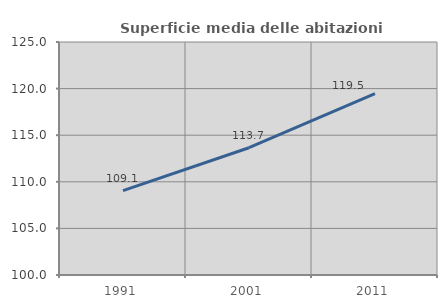
| Category | Superficie media delle abitazioni occupate |
|---|---|
| 1991.0 | 109.054 |
| 2001.0 | 113.657 |
| 2011.0 | 119.46 |